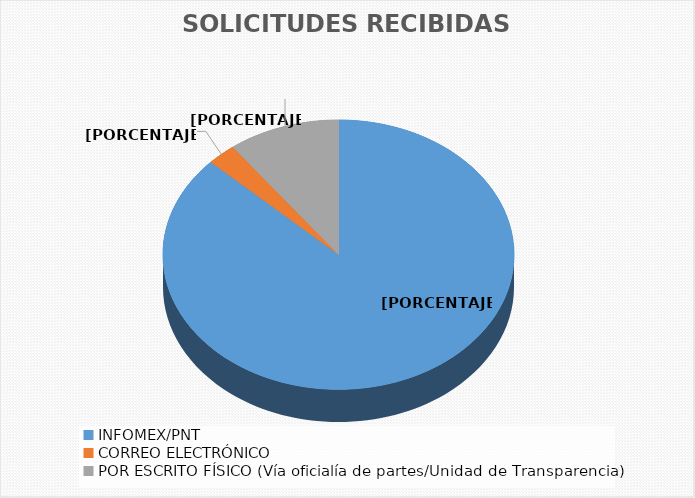
| Category | Series 0 |
|---|---|
| INFOMEX/PNT | 2140 |
| CORREO ELECTRÓNICO | 66 |
| POR ESCRITO FÍSICO (Vía oficialía de partes/Unidad de Transparencia) | 253 |